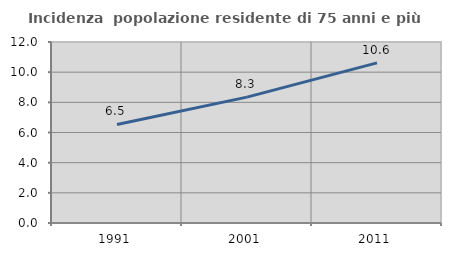
| Category | Incidenza  popolazione residente di 75 anni e più |
|---|---|
| 1991.0 | 6.532 |
| 2001.0 | 8.345 |
| 2011.0 | 10.615 |